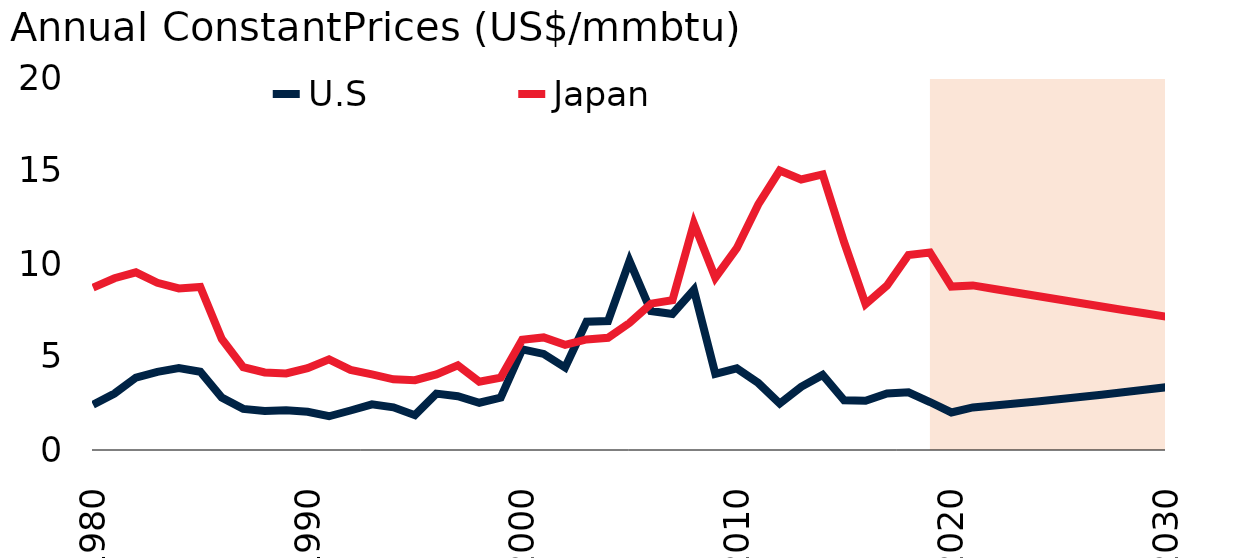
| Category | U.S | Japan |
|---|---|---|
| 1980.0 | 2.436 | 8.733 |
| 1981.0 | 3.037 | 9.235 |
| 1982.0 | 3.891 | 9.552 |
| 1983.0 | 4.204 | 8.992 |
| 1984.0 | 4.402 | 8.684 |
| 1985.0 | 4.207 | 8.762 |
| 1986.0 | 2.819 | 5.972 |
| 1987.0 | 2.21 | 4.453 |
| 1988.0 | 2.099 | 4.169 |
| 1989.0 | 2.131 | 4.119 |
| 1990.0 | 2.054 | 4.403 |
| 1991.0 | 1.815 | 4.871 |
| 1992.0 | 2.123 | 4.308 |
| 1993.0 | 2.457 | 4.062 |
| 1994.0 | 2.293 | 3.798 |
| 1995.0 | 1.874 | 3.752 |
| 1996.0 | 3.032 | 4.067 |
| 1997.0 | 2.888 | 4.549 |
| 1998.0 | 2.54 | 3.674 |
| 1999.0 | 2.813 | 3.893 |
| 2000.0 | 5.415 | 5.923 |
| 2001.0 | 5.166 | 6.052 |
| 2002.0 | 4.433 | 5.657 |
| 2003.0 | 6.898 | 5.942 |
| 2004.0 | 6.933 | 6.031 |
| 2005.0 | 10.166 | 6.83 |
| 2006.0 | 7.472 | 7.868 |
| 2007.0 | 7.316 | 8.051 |
| 2008.0 | 8.613 | 12.181 |
| 2009.0 | 4.095 | 9.264 |
| 2010.0 | 4.385 | 10.848 |
| 2011.0 | 3.602 | 13.204 |
| 2012.0 | 2.498 | 15.025 |
| 2013.0 | 3.395 | 14.546 |
| 2014.0 | 4.038 | 14.818 |
| 2015.0 | 2.671 | 11.174 |
| 2016.0 | 2.65 | 7.84 |
| 2017.0 | 3.041 | 8.843 |
| 2018.0 | 3.1 | 10.483 |
| 2019.0 | 2.579 | 10.62 |
| 2020.0 | 2.02 | 8.789 |
| 2021.0 | 2.287 | 8.849 |
| 2022.0 | 2.392 | 8.659 |
| 2023.0 | 2.5 | 8.468 |
| 2024.0 | 2.612 | 8.277 |
| 2025.0 | 2.728 | 8.088 |
| 2026.0 | 2.848 | 7.9 |
| 2027.0 | 2.973 | 7.714 |
| 2028.0 | 3.102 | 7.53 |
| 2029.0 | 3.235 | 7.348 |
| 2030.0 | 3.374 | 7.169 |